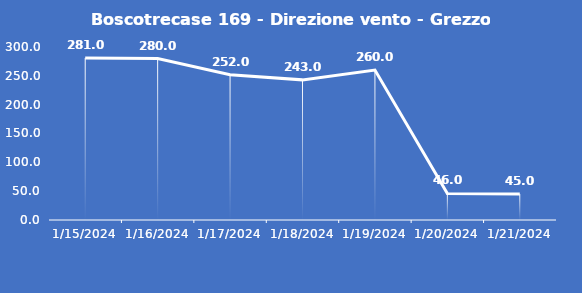
| Category | Boscotrecase 169 - Direzione vento - Grezzo (°N) |
|---|---|
| 1/15/24 | 281 |
| 1/16/24 | 280 |
| 1/17/24 | 252 |
| 1/18/24 | 243 |
| 1/19/24 | 260 |
| 1/20/24 | 46 |
| 1/21/24 | 45 |